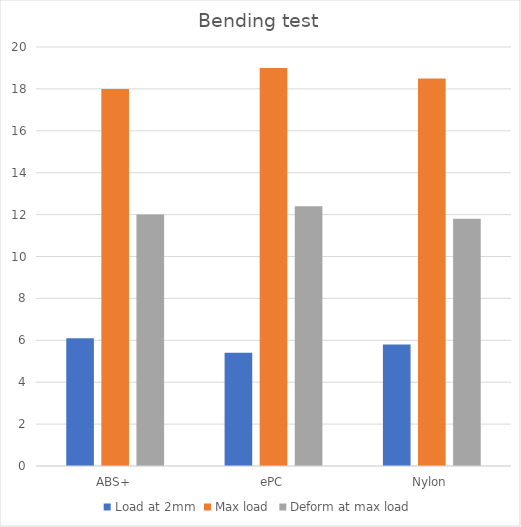
| Category | Load at 2mm | Max load | Deform at max load |
|---|---|---|---|
| ABS+ | 6.1 | 18 | 12 |
| ePC | 5.4 | 19 | 12.4 |
| Nylon | 5.8 | 18.5 | 11.8 |